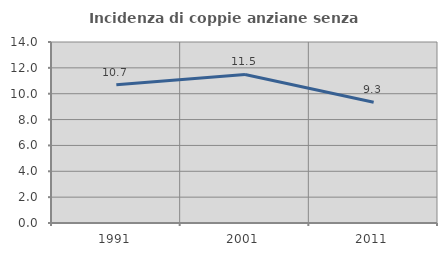
| Category | Incidenza di coppie anziane senza figli  |
|---|---|
| 1991.0 | 10.693 |
| 2001.0 | 11.488 |
| 2011.0 | 9.344 |